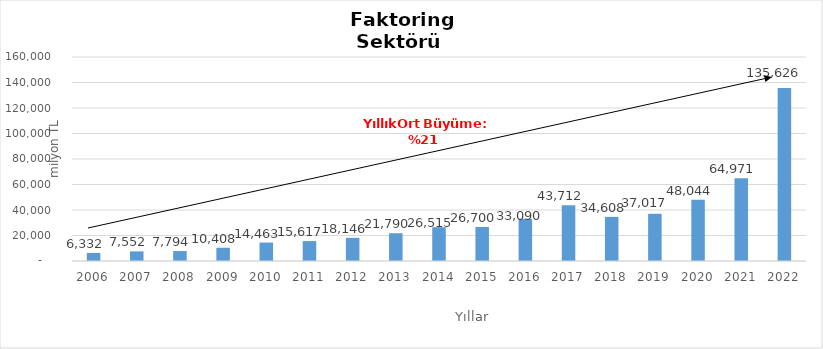
| Category | Faktoring  |
|---|---|
| 2006.0 | 6331.998 |
| 2007.0 | 7552.18 |
| 2008.0 | 7794.497 |
| 2009.0 | 10407.622 |
| 2010.0 | 14462.609 |
| 2011.0 | 15617.092 |
| 2012.0 | 18146.479 |
| 2013.0 | 21790.367 |
| 2014.0 | 26515 |
| 2015.0 | 26700 |
| 2016.0 | 33090 |
| 2017.0 | 43712 |
| 2018.0 | 34608 |
| 2019.0 | 37017 |
| 2020.0 | 48044 |
| 2021.0 | 64971 |
| 2022.0 | 135626 |